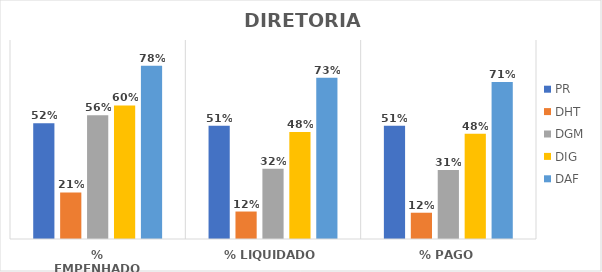
| Category | PR | DHT | DGM | DIG | DAF |
|---|---|---|---|---|---|
| % EMPENHADO | 0.523 | 0.211 | 0.56 | 0.604 | 0.784 |
| % LIQUIDADO | 0.512 | 0.124 | 0.318 | 0.484 | 0.729 |
| % PAGO | 0.512 | 0.119 | 0.312 | 0.477 | 0.71 |